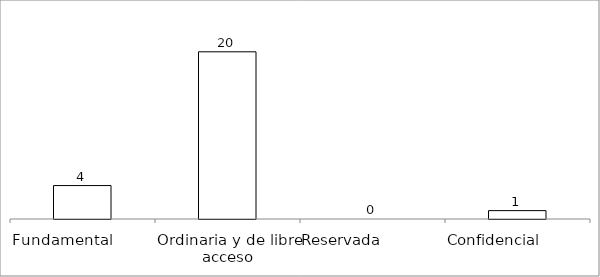
| Category | Series 0 |
|---|---|
| Fundamental         | 4 |
| Ordinaria y de libre acceso | 20 |
| Reservada               | 0 |
| Confidencial             | 1 |